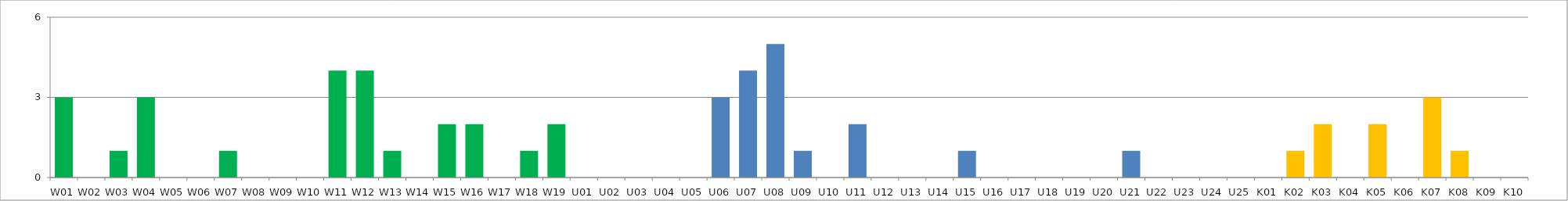
| Category | Series 0 |
|---|---|
| W01 | 3 |
| W02 | 0 |
| W03 | 1 |
| W04 | 3 |
| W05 | 0 |
| W06 | 0 |
| W07 | 1 |
| W08 | 0 |
| W09 | 0 |
| W10 | 0 |
| W11 | 4 |
| W12 | 4 |
| W13 | 1 |
| W14 | 0 |
| W15 | 2 |
| W16 | 2 |
| W17 | 0 |
| W18 | 1 |
| W19 | 2 |
| U01 | 0 |
| U02 | 0 |
| U03 | 0 |
| U04 | 0 |
| U05 | 0 |
| U06 | 3 |
| U07 | 4 |
| U08 | 5 |
| U09 | 1 |
| U10 | 0 |
| U11 | 2 |
| U12 | 0 |
| U13 | 0 |
| U14 | 0 |
| U15 | 1 |
| U16 | 0 |
| U17 | 0 |
| U18 | 0 |
| U19 | 0 |
| U20 | 0 |
| U21 | 1 |
| U22 | 0 |
| U23 | 0 |
| U24 | 0 |
| U25 | 0 |
| K01 | 0 |
| K02 | 1 |
| K03 | 2 |
| K04 | 0 |
| K05 | 2 |
| K06 | 0 |
| K07 | 3 |
| K08 | 1 |
| K09 | 0 |
| K10 | 0 |